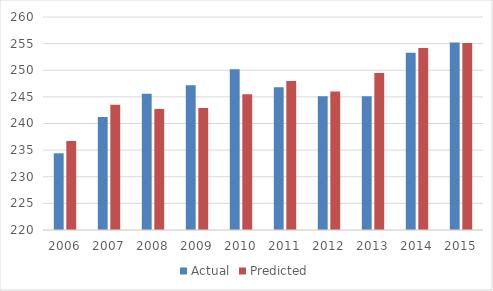
| Category | Actual | Predicted |
|---|---|---|
| 2006.0 | 234.4 | 236.7 |
| 2007.0 | 241.2 | 243.5 |
| 2008.0 | 245.6 | 242.7 |
| 2009.0 | 247.2 | 242.9 |
| 2010.0 | 250.2 | 245.5 |
| 2011.0 | 246.8 | 248 |
| 2012.0 | 245.1 | 246 |
| 2013.0 | 245.1 | 249.5 |
| 2014.0 | 253.3 | 254.2 |
| 2015.0 | 255.2 | 255.1 |